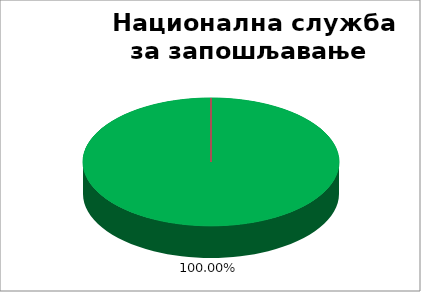
| Category | Национална служба за запошљавање  |
|---|---|
| 0 | 1 |
| 1 | 0 |
| 2 | 0 |
| 3 | 0 |
| 4 | 0 |